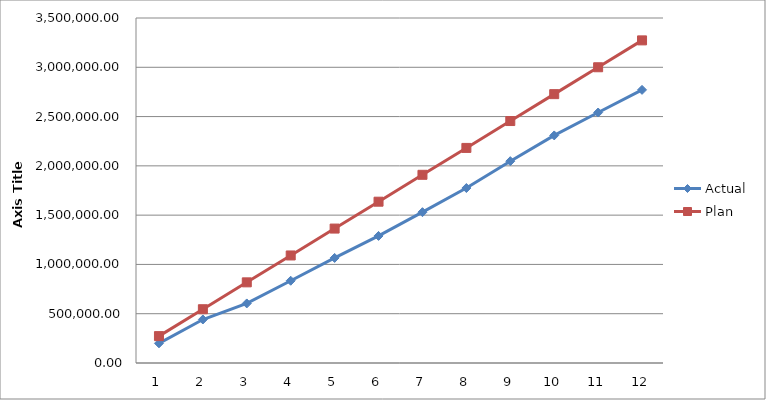
| Category | Actual | Plan |
|---|---|---|
| 0 | 199706.67 | 272750 |
| 1 | 441307.24 | 545500 |
| 2 | 604233.96 | 818250 |
| 3 | 834430.87 | 1091000 |
| 4 | 1066049.02 | 1363750 |
| 5 | 1289073.33 | 1636500 |
| 6 | 1530096.67 | 1909250 |
| 7 | 1774976.2 | 2182000 |
| 8 | 2047668.21 | 2454750 |
| 9 | 2308691.01 | 2727500 |
| 10 | 2541247.78 | 3000250 |
| 11 | 2770879.17 | 3273000 |